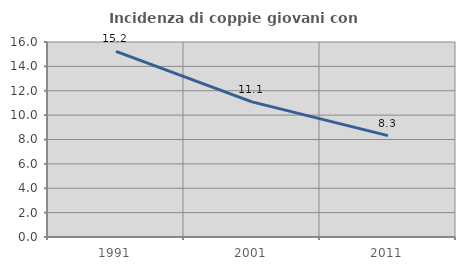
| Category | Incidenza di coppie giovani con figli |
|---|---|
| 1991.0 | 15.223 |
| 2001.0 | 11.084 |
| 2011.0 | 8.316 |